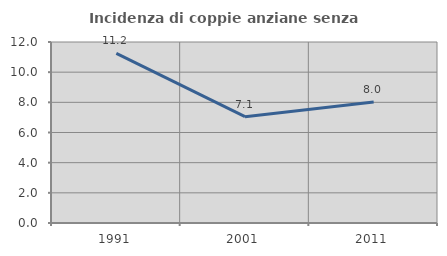
| Category | Incidenza di coppie anziane senza figli  |
|---|---|
| 1991.0 | 11.24 |
| 2001.0 | 7.051 |
| 2011.0 | 8.027 |